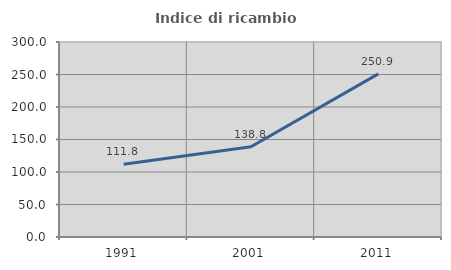
| Category | Indice di ricambio occupazionale  |
|---|---|
| 1991.0 | 111.834 |
| 2001.0 | 138.78 |
| 2011.0 | 250.904 |